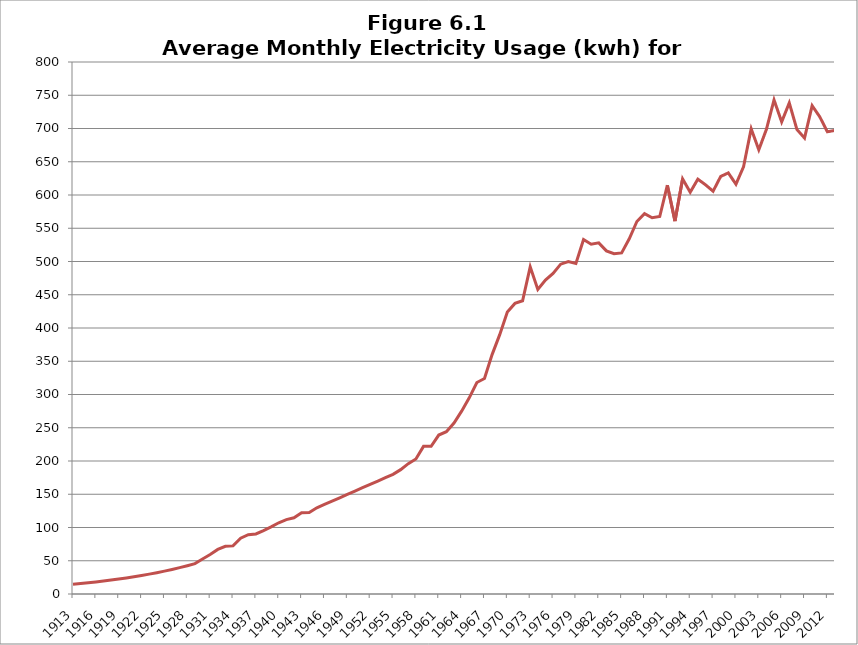
| Category | Residential Usage (kwh) |
|---|---|
| 1913.0 | 14.723 |
| 1914.0 | 15.803 |
| 1915.0 | 16.962 |
| 1916.0 | 18.207 |
| 1917.0 | 19.542 |
| 1918.0 | 20.976 |
| 1919.0 | 22.515 |
| 1920.0 | 24.166 |
| 1921.0 | 25.939 |
| 1922.0 | 27.842 |
| 1923.0 | 29.885 |
| 1924.0 | 32.077 |
| 1925.0 | 34.43 |
| 1926.0 | 36.956 |
| 1927.0 | 39.667 |
| 1928.0 | 42.577 |
| 1929.0 | 45.7 |
| 1930.0 | 52.75 |
| 1931.0 | 59.33 |
| 1932.0 | 67 |
| 1933.0 | 71.7 |
| 1934.0 | 72.33 |
| 1935.0 | 83.83 |
| 1936.0 | 89.17 |
| 1937.0 | 90.33 |
| 1938.0 | 95.42 |
| 1939.0 | 100.92 |
| 1940.0 | 107.08 |
| 1941.0 | 111.83 |
| 1942.0 | 114.58 |
| 1943.0 | 122.08 |
| 1944.0 | 122.67 |
| 1945.0 | 129.58 |
| 1946.0 | 134.622 |
| 1947.0 | 139.664 |
| 1948.0 | 144.706 |
| 1949.0 | 149.748 |
| 1950.0 | 154.79 |
| 1951.0 | 159.832 |
| 1952.0 | 164.874 |
| 1953.0 | 169.916 |
| 1954.0 | 174.958 |
| 1955.0 | 180 |
| 1956.0 | 187 |
| 1957.0 | 196 |
| 1958.0 | 203 |
| 1959.0 | 222 |
| 1960.0 | 222 |
| 1961.0 | 239 |
| 1962.0 | 244 |
| 1963.0 | 257 |
| 1964.0 | 275 |
| 1965.0 | 295 |
| 1966.0 | 318 |
| 1967.0 | 324 |
| 1968.0 | 360 |
| 1969.0 | 390 |
| 1970.0 | 424 |
| 1971.0 | 437 |
| 1972.0 | 441 |
| 1973.0 | 492 |
| 1974.0 | 458 |
| 1975.0 | 472 |
| 1976.0 | 482 |
| 1977.0 | 496 |
| 1978.0 | 500 |
| 1979.0 | 497 |
| 1980.0 | 533 |
| 1981.0 | 526 |
| 1982.0 | 528 |
| 1983.0 | 516 |
| 1984.0 | 511.833 |
| 1985.0 | 512.917 |
| 1986.0 | 534.083 |
| 1987.0 | 560.167 |
| 1988.0 | 572 |
| 1989.0 | 565.75 |
| 1990.0 | 567.667 |
| 1991.0 | 614.75 |
| 1992.0 | 560.75 |
| 1993.0 | 624.25 |
| 1994.0 | 604.167 |
| 1995.0 | 623.833 |
| 1996.0 | 615.417 |
| 1997.0 | 605.667 |
| 1998.0 | 627.917 |
| 1999.0 | 633.25 |
| 2000.0 | 616.167 |
| 2001.0 | 642.5 |
| 2002.0 | 699.583 |
| 2003.0 | 668 |
| 2004.0 | 698.75 |
| 2005.0 | 743 |
| 2006.0 | 709.917 |
| 2007.0 | 738.5 |
| 2008.0 | 698.583 |
| 2009.0 | 685.667 |
| 2010.0 | 734.333 |
| 2011.0 | 717.583 |
| 2012.0 | 695.083 |
| 2013.0 | 697.167 |